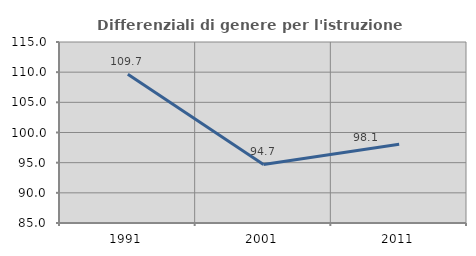
| Category | Differenziali di genere per l'istruzione superiore |
|---|---|
| 1991.0 | 109.65 |
| 2001.0 | 94.703 |
| 2011.0 | 98.066 |